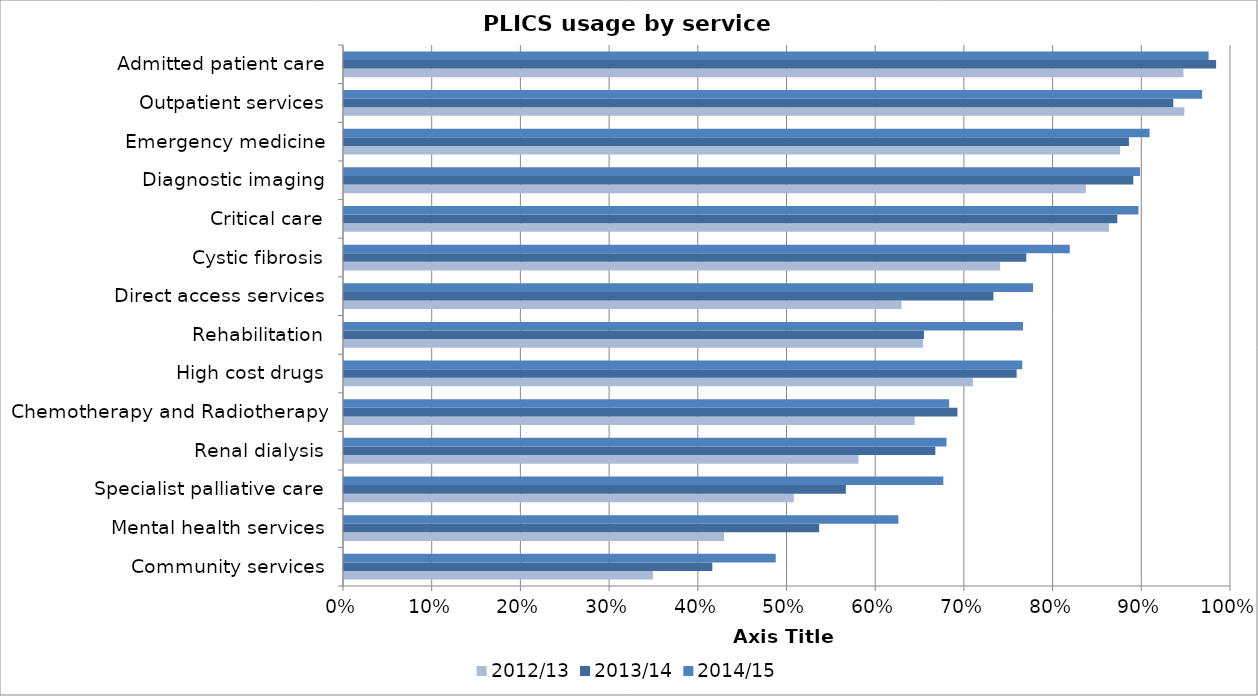
| Category | 2012/13 | 2013/14 | 2014/15 |
|---|---|---|---|
| Community services | 0.348 | 0.415 | 0.487 |
| Mental health services | 0.429 | 0.536 | 0.625 |
| Specialist palliative care | 0.507 | 0.566 | 0.676 |
| Renal dialysis | 0.58 | 0.667 | 0.679 |
| Chemotherapy and Radiotherapy | 0.643 | 0.692 | 0.682 |
| High cost drugs | 0.709 | 0.758 | 0.765 |
| Rehabilitation | 0.653 | 0.654 | 0.765 |
| Direct access services | 0.629 | 0.732 | 0.777 |
| Cystic fibrosis | 0.74 | 0.769 | 0.818 |
| Critical care | 0.862 | 0.872 | 0.896 |
| Diagnostic imaging | 0.836 | 0.89 | 0.897 |
| Emergency medicine | 0.875 | 0.885 | 0.908 |
| Outpatient services | 0.947 | 0.935 | 0.967 |
| Admitted patient care | 0.946 | 0.983 | 0.975 |